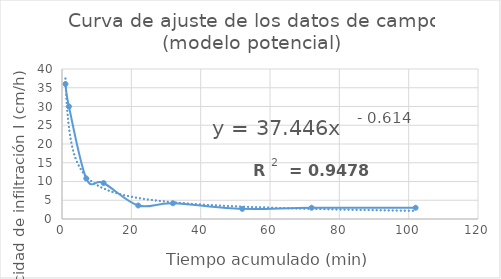
| Category | Series 0 |
|---|---|
| 1.0 | 36 |
| 2.0 | 30 |
| 7.0 | 10.8 |
| 12.0 | 9.6 |
| 22.0 | 3.6 |
| 32.0 | 4.2 |
| 52.0 | 2.7 |
| 72.0 | 3 |
| 102.0 | 3 |